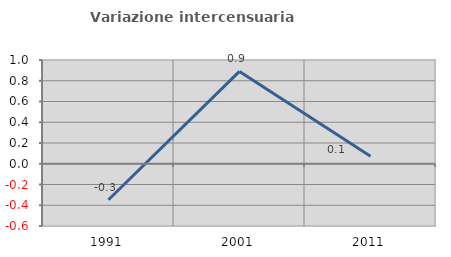
| Category | Variazione intercensuaria annua |
|---|---|
| 1991.0 | -0.347 |
| 2001.0 | 0.89 |
| 2011.0 | 0.073 |